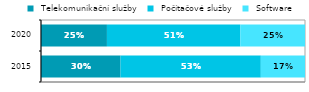
| Category |  Telekomunikační služby |  Počítačové služby |  Software |
|---|---|---|---|
|  2015 | 0.301 | 0.531 | 0.167 |
|  2020 | 0.25 | 0.505 | 0.245 |